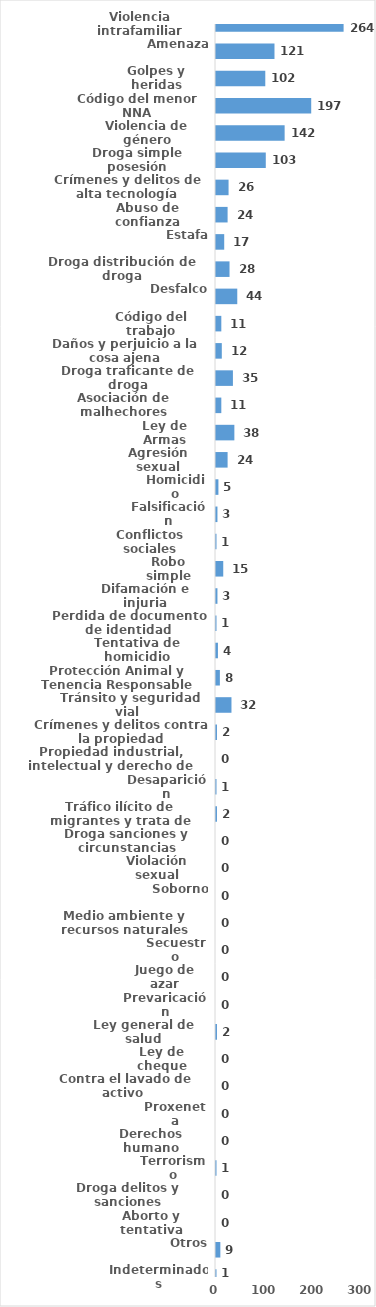
| Category | Series 0 |
|---|---|
| Violencia intrafamiliar | 264 |
| Amenaza | 121 |
| Golpes y heridas | 102 |
| Código del menor NNA | 197 |
| Violencia de género | 142 |
| Droga simple posesión | 103 |
| Crímenes y delitos de alta tecnología | 26 |
| Abuso de confianza | 24 |
| Estafa | 17 |
| Droga distribución de droga | 28 |
| Desfalco | 44 |
| Código del trabajo | 11 |
| Daños y perjuicio a la cosa ajena | 12 |
| Droga traficante de droga | 35 |
| Asociación de malhechores | 11 |
| Ley de Armas | 38 |
| Agresión sexual | 24 |
| Homicidio | 5 |
| Falsificación | 3 |
| Conflictos sociales | 1 |
| Robo simple | 15 |
| Difamación e injuria | 3 |
| Perdida de documento de identidad | 1 |
| Tentativa de homicidio | 4 |
| Protección Animal y Tenencia Responsable | 8 |
| Tránsito y seguridad vial  | 32 |
| Crímenes y delitos contra la propiedad | 2 |
| Propiedad industrial, intelectual y derecho de autor | 0 |
| Desaparición | 1 |
| Tráfico ilícito de migrantes y trata de personas | 2 |
| Droga sanciones y circunstancias agravantes | 0 |
| Violación sexual | 0 |
| Soborno | 0 |
| Medio ambiente y recursos naturales | 0 |
| Secuestro | 0 |
| Juego de azar | 0 |
| Prevaricación | 0 |
| Ley general de salud | 2 |
| Ley de cheque | 0 |
| Contra el lavado de activo  | 0 |
| Proxeneta | 0 |
| Derechos humano | 0 |
| Terrorismo | 1 |
| Droga delitos y sanciones | 0 |
| Aborto y tentativa | 0 |
| Otros | 9 |
| Indeterminados | 1 |